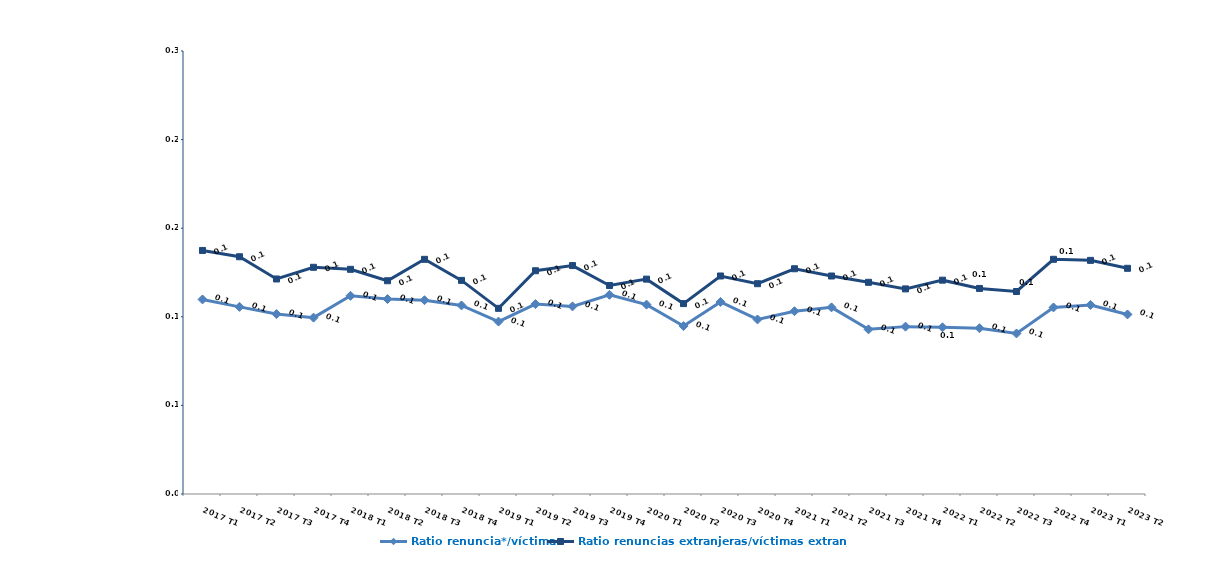
| Category | Ratio renuncia*/víctima | Ratio renuncias extranjeras/víctimas extranjeras |
|---|---|---|
| 2017 T1 | 0.11 | 0.137 |
| 2017 T2 | 0.106 | 0.134 |
| 2017 T3 | 0.102 | 0.121 |
| 2017 T4 | 0.1 | 0.128 |
| 2018 T1 | 0.112 | 0.127 |
| 2018 T2 | 0.11 | 0.12 |
| 2018 T3 | 0.109 | 0.132 |
| 2018 T4 | 0.106 | 0.121 |
| 2019 T1 | 0.097 | 0.105 |
| 2019 T2 | 0.107 | 0.126 |
| 2019 T3 | 0.106 | 0.129 |
| 2019 T4 | 0.112 | 0.118 |
| 2020 T1 | 0.107 | 0.121 |
| 2020 T2 | 0.095 | 0.107 |
| 2020 T3 | 0.108 | 0.123 |
| 2020 T4 | 0.098 | 0.119 |
| 2021 T1 | 0.103 | 0.127 |
| 2021 T2 | 0.105 | 0.123 |
| 2021 T3 | 0.093 | 0.119 |
| 2021 T4 | 0.094 | 0.116 |
| 2022 T1 | 0.094 | 0.121 |
| 2022 T2 | 0.094 | 0.116 |
| 2022 T3 | 0.091 | 0.114 |
| 2022 T4 | 0.105 | 0.132 |
| 2023 T1 | 0.107 | 0.132 |
| 2023 T2 | 0.101 | 0.127 |